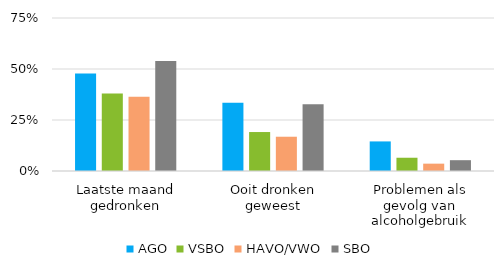
| Category | AGO | VSBO | HAVO/VWO | SBO |
|---|---|---|---|---|
| Laatste maand gedronken | 0.478 | 0.38 | 0.364 | 0.539 |
| Ooit dronken geweest | 0.335 | 0.191 | 0.168 | 0.327 |
| Problemen als gevolg van alcoholgebruik | 0.145 | 0.065 | 0.036 | 0.053 |